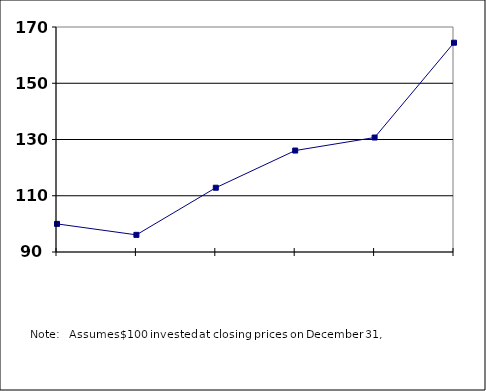
| Category |  100.00  |
|---|---|
| nan | 100 |
| 2015.0 | 96.096 |
| 2016.0 | 112.851 |
| 2017.0 | 126.073 |
| 2018.0 | 130.705 |
| 2019.0 | 164.413 |